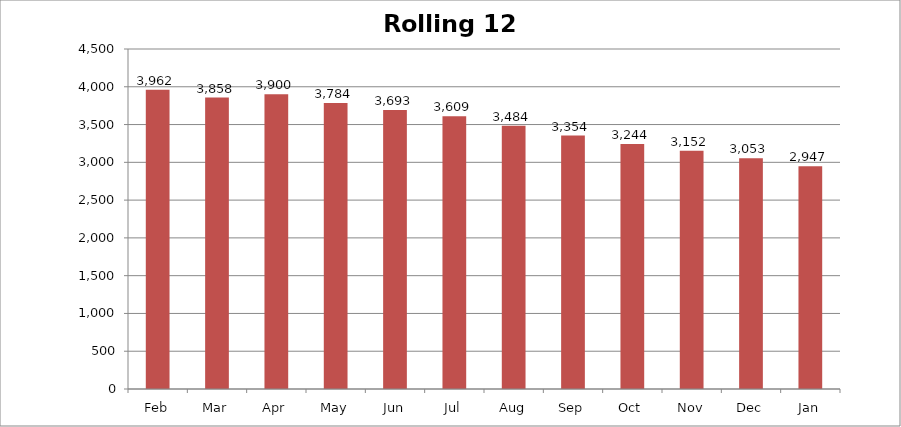
| Category | Rolling 12 Month |
|---|---|
| Feb | 3962 |
| Mar | 3858 |
| Apr | 3900 |
| May | 3784 |
| Jun | 3693 |
| Jul | 3609 |
| Aug | 3484 |
| Sep | 3354 |
| Oct | 3244 |
| Nov | 3152 |
| Dec | 3053 |
| Jan | 2947 |